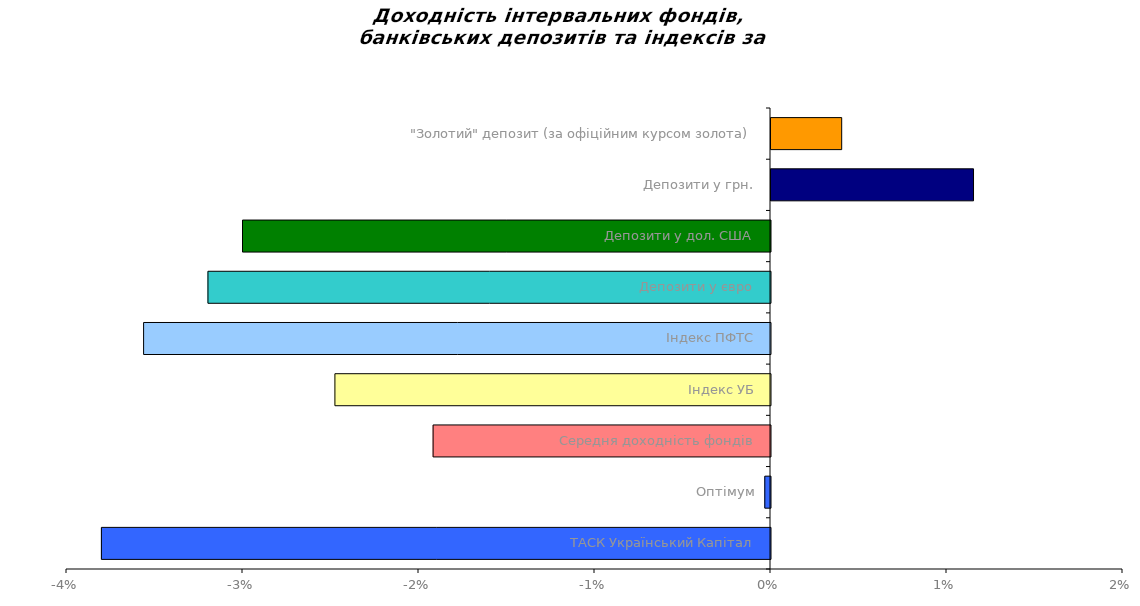
| Category | Series 0 |
|---|---|
| ТАСК Український Капітал | -0.038 |
| Оптімум | 0 |
| Середня доходність фондів | -0.019 |
| Індекс УБ | -0.025 |
| Індекс ПФТС | -0.036 |
| Депозити у євро | -0.032 |
| Депозити у дол. США | -0.03 |
| Депозити у грн. | 0.012 |
| "Золотий" депозит (за офіційним курсом золота) | 0.004 |